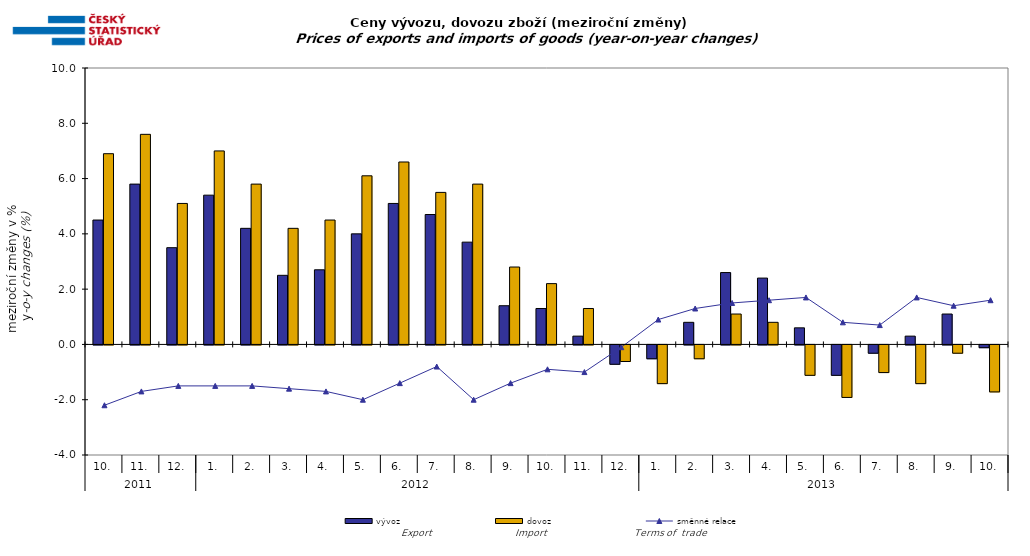
| Category | vývoz | dovoz |
|---|---|---|
| 0 | 4.5 | 6.9 |
| 1 | 5.8 | 7.6 |
| 2 | 3.5 | 5.1 |
| 3 | 5.4 | 7 |
| 4 | 4.2 | 5.8 |
| 5 | 2.5 | 4.2 |
| 6 | 2.7 | 4.5 |
| 7 | 4 | 6.1 |
| 8 | 5.1 | 6.6 |
| 9 | 4.7 | 5.5 |
| 10 | 3.7 | 5.8 |
| 11 | 1.4 | 2.8 |
| 12 | 1.3 | 2.2 |
| 13 | 0.3 | 1.3 |
| 14 | -0.7 | -0.6 |
| 15 | -0.5 | -1.4 |
| 16 | 0.8 | -0.5 |
| 17 | 2.6 | 1.1 |
| 18 | 2.4 | 0.8 |
| 19 | 0.6 | -1.1 |
| 20 | -1.1 | -1.9 |
| 21 | -0.3 | -1 |
| 22 | 0.3 | -1.4 |
| 23 | 1.1 | -0.3 |
| 24 | -0.1 | -1.7 |